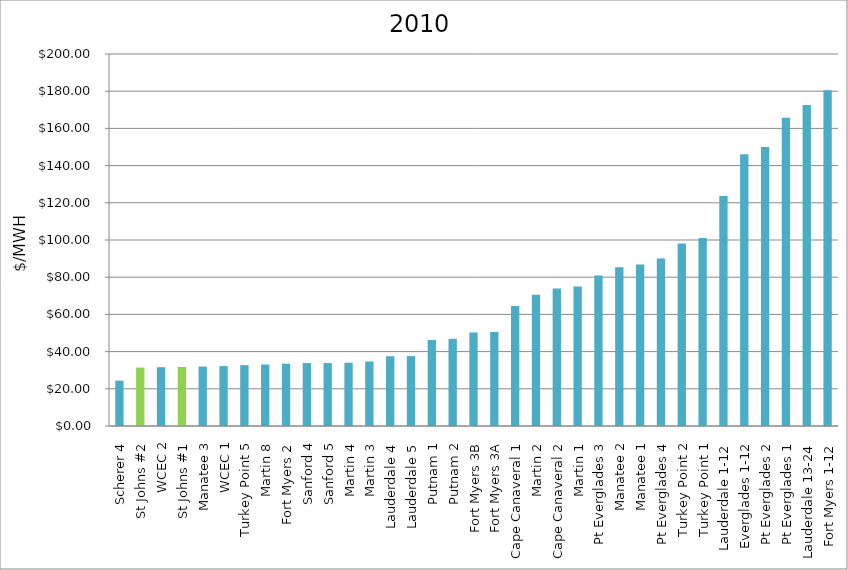
| Category | $/MWH |
|---|---|
| Scherer 4 | 24.373 |
| St Johns #2 | 31.425 |
| WCEC 2 | 31.622 |
| St Johns #1 | 31.749 |
| Manatee 3 | 31.973 |
| WCEC 1 | 32.196 |
| Turkey Point 5 | 32.732 |
| Martin 8 | 33.081 |
| Fort Myers 2 | 33.502 |
| Sanford 4 | 33.822 |
| Sanford 5 | 33.823 |
| Martin 4 | 34.014 |
| Martin 3 | 34.692 |
| Lauderdale 4 | 37.526 |
| Lauderdale 5 | 37.595 |
| Putnam 1 | 46.298 |
| Putnam 2 | 46.969 |
| Fort Myers 3B | 50.264 |
| Fort Myers 3A | 50.531 |
| Cape Canaveral 1 | 64.54 |
| Martin 2 | 70.545 |
| Cape Canaveral 2 | 73.885 |
| Martin 1 | 75.052 |
| Pt Everglades 3 | 80.914 |
| Manatee 2 | 85.336 |
| Manatee 1 | 86.769 |
| Pt Everglades 4 | 90.074 |
| Turkey Point 2 | 98.119 |
| Turkey Point 1 | 101.013 |
| Lauderdale 1-12 | 123.669 |
| Everglades 1-12 | 146.109 |
| Pt Everglades 2 | 150.036 |
| Pt Everglades 1 | 165.772 |
| Lauderdale 13-24 | 172.533 |
| Fort Myers 1-12 | 180.511 |